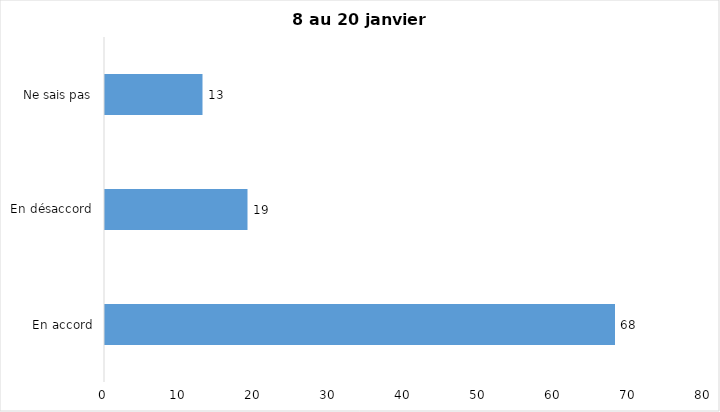
| Category | J’ai l’intention de recevoir le vaccin contre la COVID-19 lorsqu’il
sera disponible |
|---|---|
| En accord | 68 |
| En désaccord | 19 |
| Ne sais pas | 13 |